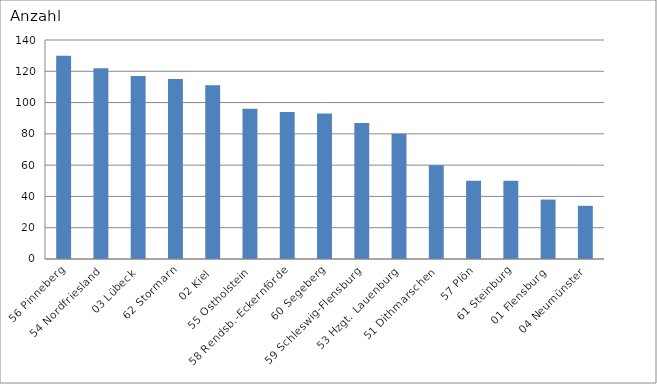
| Category | 56 Pinneberg 54 Nordfriesland 03 Lübeck 62 Stormarn 02 Kiel 55 Ostholstein 58 Rendsb.-Eckernförde 60 Segeberg 59 Schleswig-Flensburg 53 Hzgt. Lauenburg 51 Dithmarschen 57 Plön 61 Steinburg 01 Flensburg 04 Neumünster |
|---|---|
| 56 Pinneberg | 130 |
| 54 Nordfriesland | 122 |
| 03 Lübeck | 117 |
| 62 Stormarn | 115 |
| 02 Kiel | 111 |
| 55 Ostholstein | 96 |
| 58 Rendsb.-Eckernförde | 94 |
| 60 Segeberg | 93 |
| 59 Schleswig-Flensburg | 87 |
| 53 Hzgt. Lauenburg | 80 |
| 51 Dithmarschen | 60 |
| 57 Plön | 50 |
| 61 Steinburg | 50 |
| 01 Flensburg | 38 |
| 04 Neumünster | 34 |